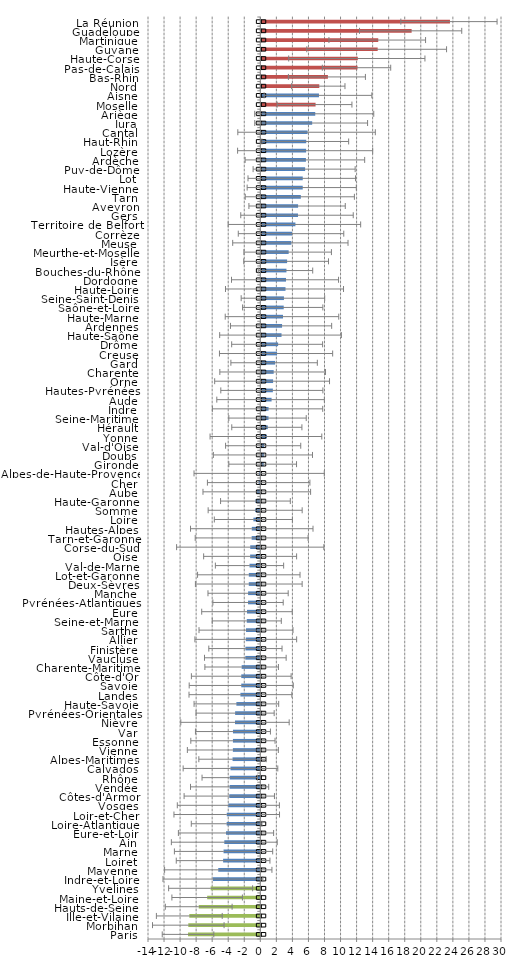
| Category | Series 0 | IC natio1 | IC nation 2 |
|---|---|---|---|
| Paris | -9.011 | 0.552 | -0.552 |
| Morbihan | -8.978 | 0.552 | -0.552 |
| Ille-et-Vilaine | -8.853 | 0.552 | -0.552 |
| Hauts-de-Seine | -7.676 | 0.552 | -0.552 |
| Maine-et-Loire | -6.627 | 0.552 | -0.552 |
| Yvelines | -6.194 | 0.552 | -0.552 |
| Indre-et-Loire | -5.905 | 0.552 | -0.552 |
| Mayenne | -5.242 | 0.552 | -0.552 |
| Loiret | -4.638 | 0.552 | -0.552 |
| Marne | -4.583 | 0.552 | -0.552 |
| Ain | -4.489 | 0.552 | -0.552 |
| Eure-et-Loir | -4.277 | 0.552 | -0.552 |
| Loire-Atlantique | -4.201 | 0.552 | -0.552 |
| Loir-et-Cher | -4.185 | 0.552 | -0.552 |
| Vosges | -3.986 | 0.552 | -0.552 |
| Côtes-d'Armor | -3.868 | 0.552 | -0.552 |
| Vendée | -3.828 | 0.552 | -0.552 |
| Rhône | -3.815 | 0.552 | -0.552 |
| Calvados | -3.721 | 0.552 | -0.552 |
| Alpes-Maritimes | -3.463 | 0.552 | -0.552 |
| Vienne | -3.422 | 0.552 | -0.552 |
| Essonne | -3.415 | 0.552 | -0.552 |
| Var | -3.412 | 0.552 | -0.552 |
| Nièvre | -3.157 | 0.552 | -0.552 |
| Pyrénées-Orientales | -3.142 | 0.552 | -0.552 |
| Haute-Savoie | -2.984 | 0.552 | -0.552 |
| Landes | -2.481 | 0.552 | -0.552 |
| Savoie | -2.377 | 0.552 | -0.552 |
| Côte-d'Or | -2.375 | 0.552 | -0.552 |
| Charente-Maritime | -2.326 | 0.552 | -0.552 |
| Vaucluse | -1.87 | 0.552 | -0.552 |
| Finistère | -1.857 | 0.552 | -0.552 |
| Allier | -1.813 | 0.552 | -0.552 |
| Sarthe | -1.784 | 0.552 | -0.552 |
| Seine-et-Marne | -1.688 | 0.552 | -0.552 |
| Eure | -1.662 | 0.552 | -0.552 |
| Pyrénées-Atlantiques | -1.529 | 0.552 | -0.552 |
| Manche | -1.524 | 0.552 | -0.552 |
| Deux-Sèvres | -1.439 | 0.552 | -0.552 |
| Lot-et-Garonne | -1.436 | 0.552 | -0.552 |
| Val-de-Marne | -1.348 | 0.552 | -0.552 |
| Oise | -1.27 | 0.552 | -0.552 |
| Corse-du-Sud | -1.258 | 0.552 | -0.552 |
| Tarn-et-Garonne | -1.081 | 0.552 | -0.552 |
| Hautes-Alpes | -1.066 | 0.552 | -0.552 |
| Loire | -0.865 | 0.552 | -0.552 |
| Somme | -0.643 | 0.552 | -0.552 |
| Haute-Garonne | -0.609 | 0.552 | -0.552 |
| Aube | -0.44 | 0.552 | -0.552 |
| Cher | -0.206 | 0.552 | -0.552 |
| Alpes-de-Haute-Provence | -0.147 | 0.552 | -0.552 |
| Gironde | 0.294 | 0.552 | -0.552 |
| Doubs | 0.326 | 0.552 | -0.552 |
| Val-d'Oise | 0.355 | 0.552 | -0.552 |
| Yonne | 0.7 | 0.552 | -0.552 |
| Hérault | 0.814 | 0.552 | -0.552 |
| Seine-Maritime | 0.899 | 0.552 | -0.552 |
| Indre | 0.902 | 0.552 | -0.552 |
| Aude | 1.278 | 0.552 | -0.552 |
| Hautes-Pyrénées | 1.437 | 0.552 | -0.552 |
| Orne | 1.469 | 0.552 | -0.552 |
| Charente | 1.541 | 0.552 | -0.552 |
| Gard | 1.72 | 0.552 | -0.552 |
| Creuse | 1.963 | 0.552 | -0.552 |
| Drôme | 2.097 | 0.552 | -0.552 |
| Haute-Saône | 2.519 | 0.552 | -0.552 |
| Ardennes | 2.586 | 0.552 | -0.552 |
| Haute-Marne | 2.701 | 0.552 | -0.552 |
| Saône-et-Loire | 2.792 | 0.552 | -0.552 |
| Seine-Saint-Denis | 2.819 | 0.552 | -0.552 |
| Haute-Loire | 3.015 | 0.552 | -0.552 |
| Dordogne | 3.079 | 0.552 | -0.552 |
| Bouches-du-Rhône | 3.134 | 0.552 | -0.552 |
| Isère | 3.216 | 0.552 | -0.552 |
| Meurthe-et-Moselle | 3.409 | 0.552 | -0.552 |
| Meuse | 3.744 | 0.552 | -0.552 |
| Corrèze | 3.827 | 0.552 | -0.552 |
| Territoire de Belfort | 4.25 | 0.552 | -0.552 |
| Gers | 4.572 | 0.552 | -0.552 |
| Aveyron | 4.584 | 0.552 | -0.552 |
| Tarn | 4.925 | 0.552 | -0.552 |
| Haute-Vienne | 5.162 | 0.552 | -0.552 |
| Lot | 5.165 | 0.552 | -0.552 |
| Puy-de-Dôme | 5.461 | 0.552 | -0.552 |
| Ardèche | 5.559 | 0.552 | -0.552 |
| Lozère | 5.587 | 0.552 | -0.552 |
| Haut-Rhin | 5.601 | 0.552 | -0.552 |
| Cantal | 5.766 | 0.552 | -0.552 |
| Jura | 6.34 | 0.552 | -0.552 |
| Ariège | 6.721 | 0.552 | -0.552 |
| Moselle | 6.763 | 0.552 | -0.552 |
| Aisne | 7.186 | 0.552 | -0.552 |
| Nord | 7.226 | 0.552 | -0.552 |
| Bas-Rhin | 8.3 | 0.552 | -0.552 |
| Pas-de-Calais | 11.991 | 0.552 | -0.552 |
| Haute-Corse | 12.029 | 0.552 | -0.552 |
| Guyane | 14.504 | 0.552 | -0.552 |
| Martinique | 14.576 | 0.552 | -0.552 |
| Guadeloupe | 18.736 | 0.552 | -0.552 |
| La Réunion | 23.514 | 0.552 | -0.552 |